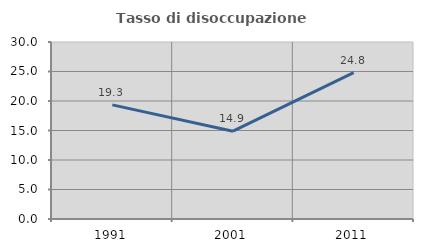
| Category | Tasso di disoccupazione giovanile  |
|---|---|
| 1991.0 | 19.349 |
| 2001.0 | 14.884 |
| 2011.0 | 24.811 |